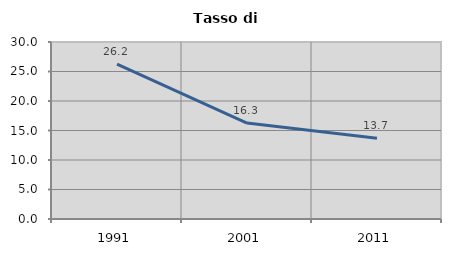
| Category | Tasso di disoccupazione   |
|---|---|
| 1991.0 | 26.241 |
| 2001.0 | 16.269 |
| 2011.0 | 13.69 |